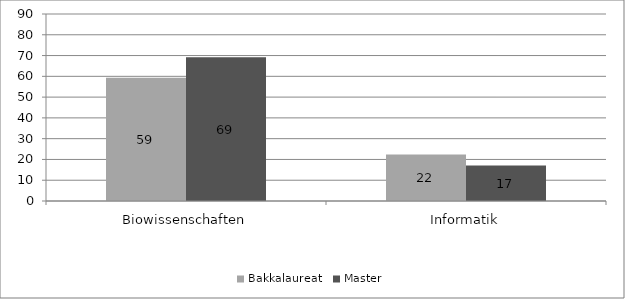
| Category | Bakkalaureat | Master |
|---|---|---|
| Biowissenschaften | 59.375 | 69.231 |
| Informatik | 22.412 | 17.143 |